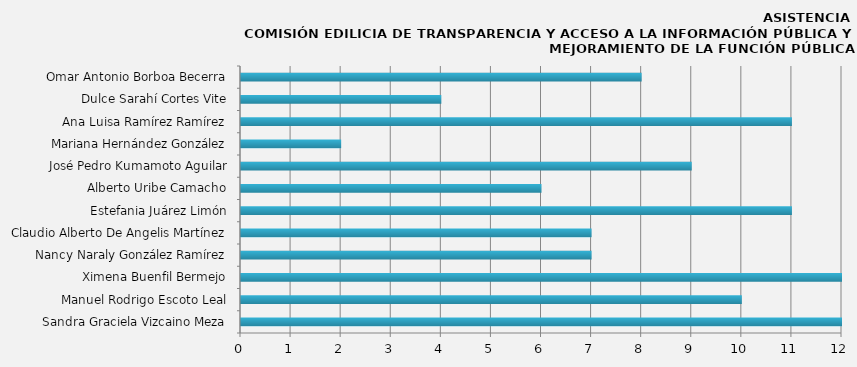
| Category | Sandra Graciela Vizcaino Meza |
|---|---|
| Sandra Graciela Vizcaino Meza | 12 |
| Manuel Rodrigo Escoto Leal | 10 |
| Ximena Buenfil Bermejo | 12 |
| Nancy Naraly González Ramírez | 7 |
| Claudio Alberto De Angelis Martínez | 7 |
| Estefania Juárez Limón | 11 |
| Alberto Uribe Camacho | 6 |
| José Pedro Kumamoto Aguilar | 9 |
| Mariana Hernández González | 2 |
| Ana Luisa Ramírez Ramírez | 11 |
| Dulce Sarahí Cortes Vite | 4 |
| Omar Antonio Borboa Becerra | 8 |